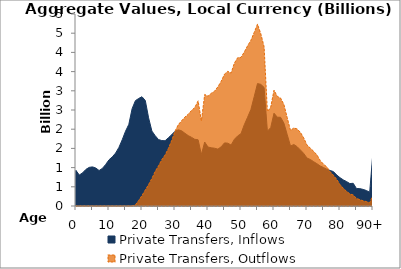
| Category | Private Transfers, Inflows | Private Transfers, Outflows |
|---|---|---|
| 0 | 924.591 | 0 |
|  | 806.217 | 0 |
| 2 | 863.68 | 0 |
| 3 | 953.036 | 0 |
| 4 | 1005.53 | 0 |
| 5 | 1019.086 | 0 |
| 6 | 988.435 | 0 |
| 7 | 923.982 | 0 |
| 8 | 979.219 | 0 |
| 9 | 1081.787 | 0 |
| 10 | 1203.29 | 0 |
| 11 | 1279.365 | 0 |
| 12 | 1378.414 | 0 |
| 13 | 1525.289 | 0 |
| 14 | 1722.781 | 0 |
| 15 | 1946.313 | 0.013 |
| 16 | 2123.798 | 0.237 |
| 17 | 2532.159 | 1.881 |
| 18 | 2742.627 | 28.14 |
| 19 | 2801.006 | 145.053 |
| 20 | 2845.193 | 272.247 |
| 21 | 2746.775 | 416.49 |
| 22 | 2295.527 | 558.088 |
| 23 | 1951.291 | 717.605 |
| 24 | 1830.869 | 901.41 |
| 25 | 1730.524 | 1043.996 |
| 26 | 1704.202 | 1205.006 |
| 27 | 1699.942 | 1328.899 |
| 28 | 1776.796 | 1499.953 |
| 29 | 1857.337 | 1705.572 |
| 30 | 1945.774 | 1946.89 |
| 31 | 1983.871 | 2117.195 |
| 32 | 1959.888 | 2218.461 |
| 33 | 1894.835 | 2314.766 |
| 34 | 1833.31 | 2387.654 |
| 35 | 1788.39 | 2486.911 |
| 36 | 1736.564 | 2564.822 |
| 37 | 1725.131 | 2737.133 |
| 38 | 1340.194 | 2218.63 |
| 39 | 1665.687 | 2904.664 |
| 40 | 1535.226 | 2858.823 |
| 41 | 1516.381 | 2936.482 |
| 42 | 1504.725 | 2989.822 |
| 43 | 1481.314 | 3105.004 |
| 44 | 1542.708 | 3248.075 |
| 45 | 1643.948 | 3433.827 |
| 46 | 1635.97 | 3506.972 |
| 47 | 1587.362 | 3461.666 |
| 48 | 1736.725 | 3721.416 |
| 49 | 1825.437 | 3862.51 |
| 50 | 1883.682 | 3870.311 |
| 51 | 2116.973 | 4010.209 |
| 52 | 2311.468 | 4171.678 |
| 53 | 2512.979 | 4315.512 |
| 54 | 2848.292 | 4519.105 |
| 55 | 3188.791 | 4735.763 |
| 56 | 3167.682 | 4485.09 |
| 57 | 3086.992 | 4146.181 |
| 58 | 1949.6 | 2455.691 |
| 59 | 2038.591 | 2572.639 |
| 60 | 2416.898 | 3015.811 |
| 61 | 2312.267 | 2854.506 |
| 62 | 2310.054 | 2810.767 |
| 63 | 2158.05 | 2642.46 |
| 64 | 1860.922 | 2301.066 |
| 65 | 1561.283 | 1965.51 |
| 66 | 1602.134 | 2033.104 |
| 67 | 1545.598 | 2005.8 |
| 68 | 1459.936 | 1918.207 |
| 69 | 1368.86 | 1774.213 |
| 70 | 1248.213 | 1585.921 |
| 71 | 1211.946 | 1508.272 |
| 72 | 1155.333 | 1424.944 |
| 73 | 1101.999 | 1332.021 |
| 74 | 1042.719 | 1186.137 |
| 75 | 1001.874 | 1088.082 |
| 76 | 959.74 | 1019.171 |
| 77 | 924.66 | 893.228 |
| 78 | 897.02 | 800.52 |
| 79 | 808.566 | 693.735 |
| 80 | 737.417 | 557.36 |
| 81 | 680.04 | 460.914 |
| 82 | 635.844 | 381.656 |
| 83 | 583.563 | 313.985 |
| 84 | 592.038 | 287.264 |
| 85 | 454.782 | 197.695 |
| 86 | 452.496 | 165.43 |
| 87 | 431.837 | 134.037 |
| 88 | 402.73 | 115.531 |
| 89 | 358.9 | 86.286 |
| 90+ | 1415.536 | 279.383 |